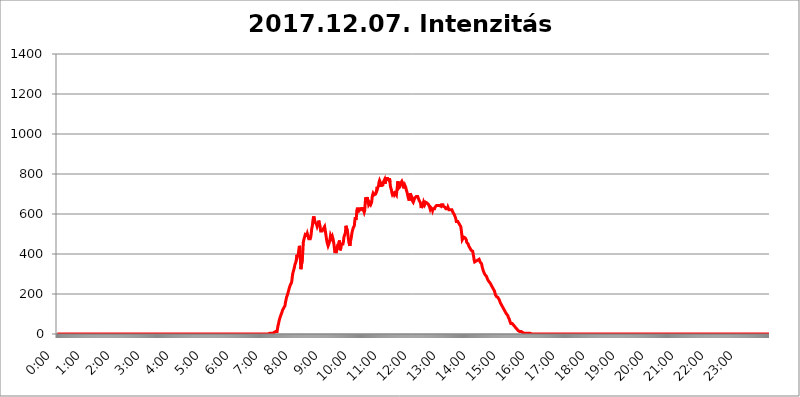
| Category | 2017.12.07. Intenzitás [W/m^2] |
|---|---|
| 0.0 | 0 |
| 0.0006944444444444445 | 0 |
| 0.001388888888888889 | 0 |
| 0.0020833333333333333 | 0 |
| 0.002777777777777778 | 0 |
| 0.003472222222222222 | 0 |
| 0.004166666666666667 | 0 |
| 0.004861111111111111 | 0 |
| 0.005555555555555556 | 0 |
| 0.0062499999999999995 | 0 |
| 0.006944444444444444 | 0 |
| 0.007638888888888889 | 0 |
| 0.008333333333333333 | 0 |
| 0.009027777777777779 | 0 |
| 0.009722222222222222 | 0 |
| 0.010416666666666666 | 0 |
| 0.011111111111111112 | 0 |
| 0.011805555555555555 | 0 |
| 0.012499999999999999 | 0 |
| 0.013194444444444444 | 0 |
| 0.013888888888888888 | 0 |
| 0.014583333333333332 | 0 |
| 0.015277777777777777 | 0 |
| 0.015972222222222224 | 0 |
| 0.016666666666666666 | 0 |
| 0.017361111111111112 | 0 |
| 0.018055555555555557 | 0 |
| 0.01875 | 0 |
| 0.019444444444444445 | 0 |
| 0.02013888888888889 | 0 |
| 0.020833333333333332 | 0 |
| 0.02152777777777778 | 0 |
| 0.022222222222222223 | 0 |
| 0.02291666666666667 | 0 |
| 0.02361111111111111 | 0 |
| 0.024305555555555556 | 0 |
| 0.024999999999999998 | 0 |
| 0.025694444444444447 | 0 |
| 0.02638888888888889 | 0 |
| 0.027083333333333334 | 0 |
| 0.027777777777777776 | 0 |
| 0.02847222222222222 | 0 |
| 0.029166666666666664 | 0 |
| 0.029861111111111113 | 0 |
| 0.030555555555555555 | 0 |
| 0.03125 | 0 |
| 0.03194444444444445 | 0 |
| 0.03263888888888889 | 0 |
| 0.03333333333333333 | 0 |
| 0.034027777777777775 | 0 |
| 0.034722222222222224 | 0 |
| 0.035416666666666666 | 0 |
| 0.036111111111111115 | 0 |
| 0.03680555555555556 | 0 |
| 0.0375 | 0 |
| 0.03819444444444444 | 0 |
| 0.03888888888888889 | 0 |
| 0.03958333333333333 | 0 |
| 0.04027777777777778 | 0 |
| 0.04097222222222222 | 0 |
| 0.041666666666666664 | 0 |
| 0.042361111111111106 | 0 |
| 0.04305555555555556 | 0 |
| 0.043750000000000004 | 0 |
| 0.044444444444444446 | 0 |
| 0.04513888888888889 | 0 |
| 0.04583333333333334 | 0 |
| 0.04652777777777778 | 0 |
| 0.04722222222222222 | 0 |
| 0.04791666666666666 | 0 |
| 0.04861111111111111 | 0 |
| 0.049305555555555554 | 0 |
| 0.049999999999999996 | 0 |
| 0.05069444444444445 | 0 |
| 0.051388888888888894 | 0 |
| 0.052083333333333336 | 0 |
| 0.05277777777777778 | 0 |
| 0.05347222222222222 | 0 |
| 0.05416666666666667 | 0 |
| 0.05486111111111111 | 0 |
| 0.05555555555555555 | 0 |
| 0.05625 | 0 |
| 0.05694444444444444 | 0 |
| 0.057638888888888885 | 0 |
| 0.05833333333333333 | 0 |
| 0.05902777777777778 | 0 |
| 0.059722222222222225 | 0 |
| 0.06041666666666667 | 0 |
| 0.061111111111111116 | 0 |
| 0.06180555555555556 | 0 |
| 0.0625 | 0 |
| 0.06319444444444444 | 0 |
| 0.06388888888888888 | 0 |
| 0.06458333333333334 | 0 |
| 0.06527777777777778 | 0 |
| 0.06597222222222222 | 0 |
| 0.06666666666666667 | 0 |
| 0.06736111111111111 | 0 |
| 0.06805555555555555 | 0 |
| 0.06874999999999999 | 0 |
| 0.06944444444444443 | 0 |
| 0.07013888888888889 | 0 |
| 0.07083333333333333 | 0 |
| 0.07152777777777779 | 0 |
| 0.07222222222222223 | 0 |
| 0.07291666666666667 | 0 |
| 0.07361111111111111 | 0 |
| 0.07430555555555556 | 0 |
| 0.075 | 0 |
| 0.07569444444444444 | 0 |
| 0.0763888888888889 | 0 |
| 0.07708333333333334 | 0 |
| 0.07777777777777778 | 0 |
| 0.07847222222222222 | 0 |
| 0.07916666666666666 | 0 |
| 0.0798611111111111 | 0 |
| 0.08055555555555556 | 0 |
| 0.08125 | 0 |
| 0.08194444444444444 | 0 |
| 0.08263888888888889 | 0 |
| 0.08333333333333333 | 0 |
| 0.08402777777777777 | 0 |
| 0.08472222222222221 | 0 |
| 0.08541666666666665 | 0 |
| 0.08611111111111112 | 0 |
| 0.08680555555555557 | 0 |
| 0.08750000000000001 | 0 |
| 0.08819444444444445 | 0 |
| 0.08888888888888889 | 0 |
| 0.08958333333333333 | 0 |
| 0.09027777777777778 | 0 |
| 0.09097222222222222 | 0 |
| 0.09166666666666667 | 0 |
| 0.09236111111111112 | 0 |
| 0.09305555555555556 | 0 |
| 0.09375 | 0 |
| 0.09444444444444444 | 0 |
| 0.09513888888888888 | 0 |
| 0.09583333333333333 | 0 |
| 0.09652777777777777 | 0 |
| 0.09722222222222222 | 0 |
| 0.09791666666666667 | 0 |
| 0.09861111111111111 | 0 |
| 0.09930555555555555 | 0 |
| 0.09999999999999999 | 0 |
| 0.10069444444444443 | 0 |
| 0.1013888888888889 | 0 |
| 0.10208333333333335 | 0 |
| 0.10277777777777779 | 0 |
| 0.10347222222222223 | 0 |
| 0.10416666666666667 | 0 |
| 0.10486111111111111 | 0 |
| 0.10555555555555556 | 0 |
| 0.10625 | 0 |
| 0.10694444444444444 | 0 |
| 0.1076388888888889 | 0 |
| 0.10833333333333334 | 0 |
| 0.10902777777777778 | 0 |
| 0.10972222222222222 | 0 |
| 0.1111111111111111 | 0 |
| 0.11180555555555556 | 0 |
| 0.11180555555555556 | 0 |
| 0.1125 | 0 |
| 0.11319444444444444 | 0 |
| 0.11388888888888889 | 0 |
| 0.11458333333333333 | 0 |
| 0.11527777777777777 | 0 |
| 0.11597222222222221 | 0 |
| 0.11666666666666665 | 0 |
| 0.1173611111111111 | 0 |
| 0.11805555555555557 | 0 |
| 0.11944444444444445 | 0 |
| 0.12013888888888889 | 0 |
| 0.12083333333333333 | 0 |
| 0.12152777777777778 | 0 |
| 0.12222222222222223 | 0 |
| 0.12291666666666667 | 0 |
| 0.12291666666666667 | 0 |
| 0.12361111111111112 | 0 |
| 0.12430555555555556 | 0 |
| 0.125 | 0 |
| 0.12569444444444444 | 0 |
| 0.12638888888888888 | 0 |
| 0.12708333333333333 | 0 |
| 0.16875 | 0 |
| 0.12847222222222224 | 0 |
| 0.12916666666666668 | 0 |
| 0.12986111111111112 | 0 |
| 0.13055555555555556 | 0 |
| 0.13125 | 0 |
| 0.13194444444444445 | 0 |
| 0.1326388888888889 | 0 |
| 0.13333333333333333 | 0 |
| 0.13402777777777777 | 0 |
| 0.13402777777777777 | 0 |
| 0.13472222222222222 | 0 |
| 0.13541666666666666 | 0 |
| 0.1361111111111111 | 0 |
| 0.13749999999999998 | 0 |
| 0.13819444444444443 | 0 |
| 0.1388888888888889 | 0 |
| 0.13958333333333334 | 0 |
| 0.14027777777777778 | 0 |
| 0.14097222222222222 | 0 |
| 0.14166666666666666 | 0 |
| 0.1423611111111111 | 0 |
| 0.14305555555555557 | 0 |
| 0.14375000000000002 | 0 |
| 0.14444444444444446 | 0 |
| 0.1451388888888889 | 0 |
| 0.1451388888888889 | 0 |
| 0.14652777777777778 | 0 |
| 0.14722222222222223 | 0 |
| 0.14791666666666667 | 0 |
| 0.1486111111111111 | 0 |
| 0.14930555555555555 | 0 |
| 0.15 | 0 |
| 0.15069444444444444 | 0 |
| 0.15138888888888888 | 0 |
| 0.15208333333333332 | 0 |
| 0.15277777777777776 | 0 |
| 0.15347222222222223 | 0 |
| 0.15416666666666667 | 0 |
| 0.15486111111111112 | 0 |
| 0.15555555555555556 | 0 |
| 0.15625 | 0 |
| 0.15694444444444444 | 0 |
| 0.15763888888888888 | 0 |
| 0.15833333333333333 | 0 |
| 0.15902777777777777 | 0 |
| 0.15972222222222224 | 0 |
| 0.16041666666666668 | 0 |
| 0.16111111111111112 | 0 |
| 0.16180555555555556 | 0 |
| 0.1625 | 0 |
| 0.16319444444444445 | 0 |
| 0.1638888888888889 | 0 |
| 0.16458333333333333 | 0 |
| 0.16527777777777777 | 0 |
| 0.16597222222222222 | 0 |
| 0.16666666666666666 | 0 |
| 0.1673611111111111 | 0 |
| 0.16805555555555554 | 0 |
| 0.16874999999999998 | 0 |
| 0.16944444444444443 | 0 |
| 0.17013888888888887 | 0 |
| 0.1708333333333333 | 0 |
| 0.17152777777777775 | 0 |
| 0.17222222222222225 | 0 |
| 0.1729166666666667 | 0 |
| 0.17361111111111113 | 0 |
| 0.17430555555555557 | 0 |
| 0.17500000000000002 | 0 |
| 0.17569444444444446 | 0 |
| 0.1763888888888889 | 0 |
| 0.17708333333333334 | 0 |
| 0.17777777777777778 | 0 |
| 0.17847222222222223 | 0 |
| 0.17916666666666667 | 0 |
| 0.1798611111111111 | 0 |
| 0.18055555555555555 | 0 |
| 0.18125 | 0 |
| 0.18194444444444444 | 0 |
| 0.1826388888888889 | 0 |
| 0.18333333333333335 | 0 |
| 0.1840277777777778 | 0 |
| 0.18472222222222223 | 0 |
| 0.18541666666666667 | 0 |
| 0.18611111111111112 | 0 |
| 0.18680555555555556 | 0 |
| 0.1875 | 0 |
| 0.18819444444444444 | 0 |
| 0.18888888888888888 | 0 |
| 0.18958333333333333 | 0 |
| 0.19027777777777777 | 0 |
| 0.1909722222222222 | 0 |
| 0.19166666666666665 | 0 |
| 0.19236111111111112 | 0 |
| 0.19305555555555554 | 0 |
| 0.19375 | 0 |
| 0.19444444444444445 | 0 |
| 0.1951388888888889 | 0 |
| 0.19583333333333333 | 0 |
| 0.19652777777777777 | 0 |
| 0.19722222222222222 | 0 |
| 0.19791666666666666 | 0 |
| 0.1986111111111111 | 0 |
| 0.19930555555555554 | 0 |
| 0.19999999999999998 | 0 |
| 0.20069444444444443 | 0 |
| 0.20138888888888887 | 0 |
| 0.2020833333333333 | 0 |
| 0.2027777777777778 | 0 |
| 0.2034722222222222 | 0 |
| 0.2041666666666667 | 0 |
| 0.20486111111111113 | 0 |
| 0.20555555555555557 | 0 |
| 0.20625000000000002 | 0 |
| 0.20694444444444446 | 0 |
| 0.2076388888888889 | 0 |
| 0.20833333333333334 | 0 |
| 0.20902777777777778 | 0 |
| 0.20972222222222223 | 0 |
| 0.21041666666666667 | 0 |
| 0.2111111111111111 | 0 |
| 0.21180555555555555 | 0 |
| 0.2125 | 0 |
| 0.21319444444444444 | 0 |
| 0.2138888888888889 | 0 |
| 0.21458333333333335 | 0 |
| 0.2152777777777778 | 0 |
| 0.21597222222222223 | 0 |
| 0.21666666666666667 | 0 |
| 0.21736111111111112 | 0 |
| 0.21805555555555556 | 0 |
| 0.21875 | 0 |
| 0.21944444444444444 | 0 |
| 0.22013888888888888 | 0 |
| 0.22083333333333333 | 0 |
| 0.22152777777777777 | 0 |
| 0.2222222222222222 | 0 |
| 0.22291666666666665 | 0 |
| 0.2236111111111111 | 0 |
| 0.22430555555555556 | 0 |
| 0.225 | 0 |
| 0.22569444444444445 | 0 |
| 0.2263888888888889 | 0 |
| 0.22708333333333333 | 0 |
| 0.22777777777777777 | 0 |
| 0.22847222222222222 | 0 |
| 0.22916666666666666 | 0 |
| 0.2298611111111111 | 0 |
| 0.23055555555555554 | 0 |
| 0.23124999999999998 | 0 |
| 0.23194444444444443 | 0 |
| 0.23263888888888887 | 0 |
| 0.2333333333333333 | 0 |
| 0.2340277777777778 | 0 |
| 0.2347222222222222 | 0 |
| 0.2354166666666667 | 0 |
| 0.23611111111111113 | 0 |
| 0.23680555555555557 | 0 |
| 0.23750000000000002 | 0 |
| 0.23819444444444446 | 0 |
| 0.2388888888888889 | 0 |
| 0.23958333333333334 | 0 |
| 0.24027777777777778 | 0 |
| 0.24097222222222223 | 0 |
| 0.24166666666666667 | 0 |
| 0.2423611111111111 | 0 |
| 0.24305555555555555 | 0 |
| 0.24375 | 0 |
| 0.24444444444444446 | 0 |
| 0.24513888888888888 | 0 |
| 0.24583333333333335 | 0 |
| 0.2465277777777778 | 0 |
| 0.24722222222222223 | 0 |
| 0.24791666666666667 | 0 |
| 0.24861111111111112 | 0 |
| 0.24930555555555556 | 0 |
| 0.25 | 0 |
| 0.25069444444444444 | 0 |
| 0.2513888888888889 | 0 |
| 0.2520833333333333 | 0 |
| 0.25277777777777777 | 0 |
| 0.2534722222222222 | 0 |
| 0.25416666666666665 | 0 |
| 0.2548611111111111 | 0 |
| 0.2555555555555556 | 0 |
| 0.25625000000000003 | 0 |
| 0.2569444444444445 | 0 |
| 0.2576388888888889 | 0 |
| 0.25833333333333336 | 0 |
| 0.2590277777777778 | 0 |
| 0.25972222222222224 | 0 |
| 0.2604166666666667 | 0 |
| 0.2611111111111111 | 0 |
| 0.26180555555555557 | 0 |
| 0.2625 | 0 |
| 0.26319444444444445 | 0 |
| 0.2638888888888889 | 0 |
| 0.26458333333333334 | 0 |
| 0.2652777777777778 | 0 |
| 0.2659722222222222 | 0 |
| 0.26666666666666666 | 0 |
| 0.2673611111111111 | 0 |
| 0.26805555555555555 | 0 |
| 0.26875 | 0 |
| 0.26944444444444443 | 0 |
| 0.2701388888888889 | 0 |
| 0.2708333333333333 | 0 |
| 0.27152777777777776 | 0 |
| 0.2722222222222222 | 0 |
| 0.27291666666666664 | 0 |
| 0.2736111111111111 | 0 |
| 0.2743055555555555 | 0 |
| 0.27499999999999997 | 0 |
| 0.27569444444444446 | 0 |
| 0.27638888888888885 | 0 |
| 0.27708333333333335 | 0 |
| 0.2777777777777778 | 0 |
| 0.27847222222222223 | 0 |
| 0.2791666666666667 | 0 |
| 0.2798611111111111 | 0 |
| 0.28055555555555556 | 0 |
| 0.28125 | 0 |
| 0.28194444444444444 | 0 |
| 0.2826388888888889 | 0 |
| 0.2833333333333333 | 0 |
| 0.28402777777777777 | 0 |
| 0.2847222222222222 | 0 |
| 0.28541666666666665 | 0 |
| 0.28611111111111115 | 0 |
| 0.28680555555555554 | 0 |
| 0.28750000000000003 | 0 |
| 0.2881944444444445 | 0 |
| 0.2888888888888889 | 0 |
| 0.28958333333333336 | 0 |
| 0.2902777777777778 | 0 |
| 0.29097222222222224 | 0 |
| 0.2916666666666667 | 0 |
| 0.2923611111111111 | 0 |
| 0.29305555555555557 | 0 |
| 0.29375 | 0 |
| 0.29444444444444445 | 0 |
| 0.2951388888888889 | 0 |
| 0.29583333333333334 | 0 |
| 0.2965277777777778 | 0 |
| 0.2972222222222222 | 0 |
| 0.29791666666666666 | 3.525 |
| 0.2986111111111111 | 3.525 |
| 0.29930555555555555 | 3.525 |
| 0.3 | 3.525 |
| 0.30069444444444443 | 3.525 |
| 0.3013888888888889 | 3.525 |
| 0.3020833333333333 | 3.525 |
| 0.30277777777777776 | 3.525 |
| 0.3034722222222222 | 7.887 |
| 0.30416666666666664 | 7.887 |
| 0.3048611111111111 | 7.887 |
| 0.3055555555555555 | 7.887 |
| 0.30624999999999997 | 12.257 |
| 0.3069444444444444 | 12.257 |
| 0.3076388888888889 | 12.257 |
| 0.30833333333333335 | 12.257 |
| 0.3090277777777778 | 29.823 |
| 0.30972222222222223 | 43.079 |
| 0.3104166666666667 | 51.951 |
| 0.3111111111111111 | 65.31 |
| 0.31180555555555556 | 74.246 |
| 0.3125 | 83.205 |
| 0.31319444444444444 | 87.692 |
| 0.3138888888888889 | 96.682 |
| 0.3145833333333333 | 101.184 |
| 0.31527777777777777 | 110.201 |
| 0.3159722222222222 | 119.235 |
| 0.31666666666666665 | 123.758 |
| 0.31736111111111115 | 128.284 |
| 0.31805555555555554 | 128.284 |
| 0.31875000000000003 | 128.284 |
| 0.3194444444444445 | 141.884 |
| 0.3201388888888889 | 160.056 |
| 0.32083333333333336 | 169.156 |
| 0.3215277777777778 | 182.82 |
| 0.32222222222222224 | 187.378 |
| 0.3229166666666667 | 196.497 |
| 0.3236111111111111 | 201.058 |
| 0.32430555555555557 | 214.746 |
| 0.325 | 223.873 |
| 0.32569444444444445 | 233 |
| 0.3263888888888889 | 237.564 |
| 0.32708333333333334 | 246.689 |
| 0.3277777777777778 | 251.251 |
| 0.3284722222222222 | 255.813 |
| 0.32916666666666666 | 269.49 |
| 0.3298611111111111 | 292.259 |
| 0.33055555555555555 | 305.898 |
| 0.33125 | 314.98 |
| 0.33194444444444443 | 324.052 |
| 0.3326388888888889 | 333.113 |
| 0.3333333333333333 | 346.682 |
| 0.3340277777777778 | 351.198 |
| 0.3347222222222222 | 360.221 |
| 0.3354166666666667 | 373.729 |
| 0.3361111111111111 | 396.164 |
| 0.3368055555555556 | 387.202 |
| 0.33749999999999997 | 391.685 |
| 0.33819444444444446 | 400.638 |
| 0.33888888888888885 | 422.943 |
| 0.33958333333333335 | 440.702 |
| 0.34027777777777773 | 431.833 |
| 0.34097222222222223 | 373.729 |
| 0.3416666666666666 | 324.052 |
| 0.3423611111111111 | 328.584 |
| 0.3430555555555555 | 328.584 |
| 0.34375 | 373.729 |
| 0.3444444444444445 | 414.035 |
| 0.3451388888888889 | 458.38 |
| 0.3458333333333334 | 471.582 |
| 0.34652777777777777 | 471.582 |
| 0.34722222222222227 | 475.972 |
| 0.34791666666666665 | 497.836 |
| 0.34861111111111115 | 502.192 |
| 0.34930555555555554 | 497.836 |
| 0.35000000000000003 | 493.475 |
| 0.3506944444444444 | 502.192 |
| 0.3513888888888889 | 502.192 |
| 0.3520833333333333 | 502.192 |
| 0.3527777777777778 | 475.972 |
| 0.3534722222222222 | 475.972 |
| 0.3541666666666667 | 475.972 |
| 0.3548611111111111 | 475.972 |
| 0.35555555555555557 | 484.735 |
| 0.35625 | 502.192 |
| 0.35694444444444445 | 528.2 |
| 0.3576388888888889 | 536.82 |
| 0.35833333333333334 | 558.261 |
| 0.3590277777777778 | 579.542 |
| 0.3597222222222222 | 588.009 |
| 0.36041666666666666 | 588.009 |
| 0.3611111111111111 | 566.793 |
| 0.36180555555555555 | 558.261 |
| 0.3625 | 562.53 |
| 0.36319444444444443 | 558.261 |
| 0.3638888888888889 | 545.416 |
| 0.3645833333333333 | 536.82 |
| 0.3652777777777778 | 541.121 |
| 0.3659722222222222 | 549.704 |
| 0.3666666666666667 | 566.793 |
| 0.3673611111111111 | 558.261 |
| 0.3680555555555556 | 558.261 |
| 0.36874999999999997 | 536.82 |
| 0.36944444444444446 | 515.223 |
| 0.37013888888888885 | 515.223 |
| 0.37083333333333335 | 515.223 |
| 0.37152777777777773 | 515.223 |
| 0.37222222222222223 | 510.885 |
| 0.3729166666666666 | 510.885 |
| 0.3736111111111111 | 528.2 |
| 0.3743055555555555 | 523.88 |
| 0.375 | 536.82 |
| 0.3756944444444445 | 536.82 |
| 0.3763888888888889 | 506.542 |
| 0.3770833333333334 | 489.108 |
| 0.37777777777777777 | 471.582 |
| 0.37847222222222227 | 458.38 |
| 0.37916666666666665 | 458.38 |
| 0.37986111111111115 | 440.702 |
| 0.38055555555555554 | 445.129 |
| 0.38125000000000003 | 453.968 |
| 0.3819444444444444 | 462.786 |
| 0.3826388888888889 | 475.972 |
| 0.3833333333333333 | 493.475 |
| 0.3840277777777778 | 497.836 |
| 0.3847222222222222 | 497.836 |
| 0.3854166666666667 | 475.972 |
| 0.3861111111111111 | 484.735 |
| 0.38680555555555557 | 475.972 |
| 0.3875 | 462.786 |
| 0.38819444444444445 | 445.129 |
| 0.3888888888888889 | 422.943 |
| 0.38958333333333334 | 405.108 |
| 0.3902777777777778 | 414.035 |
| 0.3909722222222222 | 405.108 |
| 0.39166666666666666 | 418.492 |
| 0.3923611111111111 | 427.39 |
| 0.39305555555555555 | 431.833 |
| 0.39375 | 449.551 |
| 0.39444444444444443 | 440.702 |
| 0.3951388888888889 | 445.129 |
| 0.3958333333333333 | 467.187 |
| 0.3965277777777778 | 418.492 |
| 0.3972222222222222 | 414.035 |
| 0.3979166666666667 | 431.833 |
| 0.3986111111111111 | 449.551 |
| 0.3993055555555556 | 453.968 |
| 0.39999999999999997 | 453.968 |
| 0.40069444444444446 | 449.551 |
| 0.40138888888888885 | 462.786 |
| 0.40208333333333335 | 484.735 |
| 0.40277777777777773 | 484.735 |
| 0.40347222222222223 | 489.108 |
| 0.4041666666666666 | 506.542 |
| 0.4048611111111111 | 541.121 |
| 0.4055555555555555 | 545.416 |
| 0.40625 | 541.121 |
| 0.4069444444444445 | 515.223 |
| 0.4076388888888889 | 497.836 |
| 0.4083333333333334 | 475.972 |
| 0.40902777777777777 | 458.38 |
| 0.40972222222222227 | 449.551 |
| 0.41041666666666665 | 440.702 |
| 0.41111111111111115 | 462.786 |
| 0.41180555555555554 | 471.582 |
| 0.41250000000000003 | 484.735 |
| 0.4131944444444444 | 502.192 |
| 0.4138888888888889 | 515.223 |
| 0.4145833333333333 | 523.88 |
| 0.4152777777777778 | 532.513 |
| 0.4159722222222222 | 532.513 |
| 0.4166666666666667 | 541.121 |
| 0.4173611111111111 | 566.793 |
| 0.41805555555555557 | 583.779 |
| 0.41875 | 571.049 |
| 0.41944444444444445 | 579.542 |
| 0.4201388888888889 | 617.436 |
| 0.42083333333333334 | 625.784 |
| 0.4215277777777778 | 625.784 |
| 0.4222222222222222 | 629.948 |
| 0.42291666666666666 | 625.784 |
| 0.4236111111111111 | 617.436 |
| 0.42430555555555555 | 621.613 |
| 0.425 | 621.613 |
| 0.42569444444444443 | 625.784 |
| 0.4263888888888889 | 625.784 |
| 0.4270833333333333 | 621.613 |
| 0.4277777777777778 | 621.613 |
| 0.4284722222222222 | 634.105 |
| 0.4291666666666667 | 629.948 |
| 0.4298611111111111 | 617.436 |
| 0.4305555555555556 | 609.062 |
| 0.43124999999999997 | 617.436 |
| 0.43194444444444446 | 654.791 |
| 0.43263888888888885 | 683.473 |
| 0.43333333333333335 | 683.473 |
| 0.43402777777777773 | 671.22 |
| 0.43472222222222223 | 683.473 |
| 0.4354166666666666 | 687.544 |
| 0.4361111111111111 | 663.019 |
| 0.4368055555555555 | 646.537 |
| 0.4375 | 650.667 |
| 0.4381944444444445 | 654.791 |
| 0.4388888888888889 | 650.667 |
| 0.4395833333333334 | 646.537 |
| 0.44027777777777777 | 650.667 |
| 0.44097222222222227 | 658.909 |
| 0.44166666666666665 | 683.473 |
| 0.44236111111111115 | 695.666 |
| 0.44305555555555554 | 703.762 |
| 0.44375000000000003 | 699.717 |
| 0.4444444444444444 | 695.666 |
| 0.4451388888888889 | 695.666 |
| 0.4458333333333333 | 695.666 |
| 0.4465277777777778 | 699.717 |
| 0.4472222222222222 | 707.8 |
| 0.4479166666666667 | 719.877 |
| 0.4486111111111111 | 735.89 |
| 0.44930555555555557 | 727.896 |
| 0.45 | 727.896 |
| 0.45069444444444445 | 743.859 |
| 0.4513888888888889 | 759.723 |
| 0.45208333333333334 | 767.62 |
| 0.4527777777777778 | 771.559 |
| 0.4534722222222222 | 755.766 |
| 0.45416666666666666 | 735.89 |
| 0.4548611111111111 | 755.766 |
| 0.45555555555555555 | 751.803 |
| 0.45625 | 739.877 |
| 0.45694444444444443 | 755.766 |
| 0.4576388888888889 | 759.723 |
| 0.4583333333333333 | 759.723 |
| 0.4590277777777778 | 771.559 |
| 0.4597222222222222 | 751.803 |
| 0.4604166666666667 | 759.723 |
| 0.4611111111111111 | 783.342 |
| 0.4618055555555556 | 771.559 |
| 0.46249999999999997 | 783.342 |
| 0.46319444444444446 | 775.492 |
| 0.46388888888888885 | 775.492 |
| 0.46458333333333335 | 775.492 |
| 0.46527777777777773 | 767.62 |
| 0.46597222222222223 | 779.42 |
| 0.4666666666666666 | 759.723 |
| 0.4673611111111111 | 735.89 |
| 0.4680555555555555 | 731.896 |
| 0.46875 | 719.877 |
| 0.4694444444444445 | 703.762 |
| 0.4701388888888889 | 695.666 |
| 0.4708333333333334 | 695.666 |
| 0.47152777777777777 | 691.608 |
| 0.47222222222222227 | 703.762 |
| 0.47291666666666665 | 695.666 |
| 0.47361111111111115 | 699.717 |
| 0.47430555555555554 | 703.762 |
| 0.47500000000000003 | 699.717 |
| 0.4756944444444444 | 695.666 |
| 0.4763888888888889 | 719.877 |
| 0.4770833333333333 | 739.877 |
| 0.4777777777777778 | 763.674 |
| 0.4784722222222222 | 727.896 |
| 0.4791666666666667 | 727.896 |
| 0.4798611111111111 | 727.896 |
| 0.48055555555555557 | 735.89 |
| 0.48125 | 735.89 |
| 0.48194444444444445 | 755.766 |
| 0.4826388888888889 | 759.723 |
| 0.48333333333333334 | 763.674 |
| 0.4840277777777778 | 763.674 |
| 0.4847222222222222 | 751.803 |
| 0.48541666666666666 | 739.877 |
| 0.4861111111111111 | 727.896 |
| 0.48680555555555555 | 731.896 |
| 0.4875 | 743.859 |
| 0.48819444444444443 | 739.877 |
| 0.4888888888888889 | 731.896 |
| 0.4895833333333333 | 719.877 |
| 0.4902777777777778 | 711.832 |
| 0.4909722222222222 | 703.762 |
| 0.4916666666666667 | 691.608 |
| 0.4923611111111111 | 679.395 |
| 0.4930555555555556 | 679.395 |
| 0.49374999999999997 | 667.123 |
| 0.49444444444444446 | 687.544 |
| 0.49513888888888885 | 703.762 |
| 0.49583333333333335 | 695.666 |
| 0.49652777777777773 | 695.666 |
| 0.49722222222222223 | 687.544 |
| 0.4979166666666666 | 667.123 |
| 0.4986111111111111 | 667.123 |
| 0.4993055555555555 | 658.909 |
| 0.5 | 663.019 |
| 0.5006944444444444 | 658.909 |
| 0.5013888888888889 | 679.395 |
| 0.5020833333333333 | 679.395 |
| 0.5027777777777778 | 683.473 |
| 0.5034722222222222 | 687.544 |
| 0.5041666666666667 | 683.473 |
| 0.5048611111111111 | 683.473 |
| 0.5055555555555555 | 687.544 |
| 0.50625 | 687.544 |
| 0.5069444444444444 | 687.544 |
| 0.5076388888888889 | 667.123 |
| 0.5083333333333333 | 663.019 |
| 0.5090277777777777 | 658.909 |
| 0.5097222222222222 | 650.667 |
| 0.5104166666666666 | 629.948 |
| 0.5111111111111112 | 629.948 |
| 0.5118055555555555 | 642.4 |
| 0.5125000000000001 | 634.105 |
| 0.5131944444444444 | 646.537 |
| 0.513888888888889 | 658.909 |
| 0.5145833333333333 | 658.909 |
| 0.5152777777777778 | 646.537 |
| 0.5159722222222222 | 650.667 |
| 0.5166666666666667 | 658.909 |
| 0.517361111111111 | 658.909 |
| 0.5180555555555556 | 658.909 |
| 0.5187499999999999 | 654.791 |
| 0.5194444444444445 | 654.791 |
| 0.5201388888888888 | 650.667 |
| 0.5208333333333334 | 646.537 |
| 0.5215277777777778 | 642.4 |
| 0.5222222222222223 | 634.105 |
| 0.5229166666666667 | 625.784 |
| 0.5236111111111111 | 634.105 |
| 0.5243055555555556 | 634.105 |
| 0.525 | 634.105 |
| 0.5256944444444445 | 625.784 |
| 0.5263888888888889 | 617.436 |
| 0.5270833333333333 | 625.784 |
| 0.5277777777777778 | 629.948 |
| 0.5284722222222222 | 629.948 |
| 0.5291666666666667 | 625.784 |
| 0.5298611111111111 | 634.105 |
| 0.5305555555555556 | 638.256 |
| 0.53125 | 638.256 |
| 0.5319444444444444 | 642.4 |
| 0.5326388888888889 | 638.256 |
| 0.5333333333333333 | 642.4 |
| 0.5340277777777778 | 642.4 |
| 0.5347222222222222 | 642.4 |
| 0.5354166666666667 | 642.4 |
| 0.5361111111111111 | 642.4 |
| 0.5368055555555555 | 642.4 |
| 0.5375 | 646.537 |
| 0.5381944444444444 | 638.256 |
| 0.5388888888888889 | 646.537 |
| 0.5395833333333333 | 646.537 |
| 0.5402777777777777 | 650.667 |
| 0.5409722222222222 | 646.537 |
| 0.5416666666666666 | 638.256 |
| 0.5423611111111112 | 634.105 |
| 0.5430555555555555 | 634.105 |
| 0.5437500000000001 | 634.105 |
| 0.5444444444444444 | 629.948 |
| 0.545138888888889 | 625.784 |
| 0.5458333333333333 | 625.784 |
| 0.5465277777777778 | 629.948 |
| 0.5472222222222222 | 625.784 |
| 0.5479166666666667 | 634.105 |
| 0.548611111111111 | 629.948 |
| 0.5493055555555556 | 621.613 |
| 0.5499999999999999 | 625.784 |
| 0.5506944444444445 | 621.613 |
| 0.5513888888888888 | 621.613 |
| 0.5520833333333334 | 625.784 |
| 0.5527777777777778 | 621.613 |
| 0.5534722222222223 | 621.613 |
| 0.5541666666666667 | 617.436 |
| 0.5548611111111111 | 609.062 |
| 0.5555555555555556 | 609.062 |
| 0.55625 | 604.864 |
| 0.5569444444444445 | 596.45 |
| 0.5576388888888889 | 592.233 |
| 0.5583333333333333 | 583.779 |
| 0.5590277777777778 | 575.299 |
| 0.5597222222222222 | 562.53 |
| 0.5604166666666667 | 562.53 |
| 0.5611111111111111 | 562.53 |
| 0.5618055555555556 | 562.53 |
| 0.5625 | 558.261 |
| 0.5631944444444444 | 553.986 |
| 0.5638888888888889 | 549.704 |
| 0.5645833333333333 | 545.416 |
| 0.5652777777777778 | 541.121 |
| 0.5659722222222222 | 536.82 |
| 0.5666666666666667 | 519.555 |
| 0.5673611111111111 | 497.836 |
| 0.5680555555555555 | 471.582 |
| 0.56875 | 471.582 |
| 0.5694444444444444 | 471.582 |
| 0.5701388888888889 | 484.735 |
| 0.5708333333333333 | 489.108 |
| 0.5715277777777777 | 489.108 |
| 0.5722222222222222 | 480.356 |
| 0.5729166666666666 | 475.972 |
| 0.5736111111111112 | 471.582 |
| 0.5743055555555555 | 458.38 |
| 0.5750000000000001 | 458.38 |
| 0.5756944444444444 | 462.786 |
| 0.576388888888889 | 449.551 |
| 0.5770833333333333 | 440.702 |
| 0.5777777777777778 | 436.27 |
| 0.5784722222222222 | 431.833 |
| 0.5791666666666667 | 431.833 |
| 0.579861111111111 | 431.833 |
| 0.5805555555555556 | 418.492 |
| 0.5812499999999999 | 414.035 |
| 0.5819444444444445 | 414.035 |
| 0.5826388888888888 | 414.035 |
| 0.5833333333333334 | 400.638 |
| 0.5840277777777778 | 387.202 |
| 0.5847222222222223 | 369.23 |
| 0.5854166666666667 | 360.221 |
| 0.5861111111111111 | 360.221 |
| 0.5868055555555556 | 360.221 |
| 0.5875 | 364.728 |
| 0.5881944444444445 | 360.221 |
| 0.5888888888888889 | 364.728 |
| 0.5895833333333333 | 369.23 |
| 0.5902777777777778 | 364.728 |
| 0.5909722222222222 | 369.23 |
| 0.5916666666666667 | 373.729 |
| 0.5923611111111111 | 369.23 |
| 0.5930555555555556 | 360.221 |
| 0.59375 | 360.221 |
| 0.5944444444444444 | 355.712 |
| 0.5951388888888889 | 351.198 |
| 0.5958333333333333 | 337.639 |
| 0.5965277777777778 | 328.584 |
| 0.5972222222222222 | 319.517 |
| 0.5979166666666667 | 314.98 |
| 0.5986111111111111 | 305.898 |
| 0.5993055555555555 | 305.898 |
| 0.6 | 296.808 |
| 0.6006944444444444 | 296.808 |
| 0.6013888888888889 | 296.808 |
| 0.6020833333333333 | 287.709 |
| 0.6027777777777777 | 283.156 |
| 0.6034722222222222 | 274.047 |
| 0.6041666666666666 | 269.49 |
| 0.6048611111111112 | 264.932 |
| 0.6055555555555555 | 264.932 |
| 0.6062500000000001 | 260.373 |
| 0.6069444444444444 | 255.813 |
| 0.607638888888889 | 251.251 |
| 0.6083333333333333 | 246.689 |
| 0.6090277777777778 | 242.127 |
| 0.6097222222222222 | 237.564 |
| 0.6104166666666667 | 233 |
| 0.611111111111111 | 233 |
| 0.6118055555555556 | 223.873 |
| 0.6124999999999999 | 219.309 |
| 0.6131944444444445 | 214.746 |
| 0.6138888888888888 | 205.62 |
| 0.6145833333333334 | 196.497 |
| 0.6152777777777778 | 191.937 |
| 0.6159722222222223 | 187.378 |
| 0.6166666666666667 | 182.82 |
| 0.6173611111111111 | 182.82 |
| 0.6180555555555556 | 182.82 |
| 0.61875 | 182.82 |
| 0.6194444444444445 | 178.264 |
| 0.6201388888888889 | 169.156 |
| 0.6208333333333333 | 164.605 |
| 0.6215277777777778 | 155.509 |
| 0.6222222222222222 | 150.964 |
| 0.6229166666666667 | 146.423 |
| 0.6236111111111111 | 141.884 |
| 0.6243055555555556 | 137.347 |
| 0.625 | 132.814 |
| 0.6256944444444444 | 128.284 |
| 0.6263888888888889 | 123.758 |
| 0.6270833333333333 | 119.235 |
| 0.6277777777777778 | 114.716 |
| 0.6284722222222222 | 110.201 |
| 0.6291666666666667 | 110.201 |
| 0.6298611111111111 | 101.184 |
| 0.6305555555555555 | 101.184 |
| 0.63125 | 96.682 |
| 0.6319444444444444 | 92.184 |
| 0.6326388888888889 | 83.205 |
| 0.6333333333333333 | 78.722 |
| 0.6340277777777777 | 74.246 |
| 0.6347222222222222 | 65.31 |
| 0.6354166666666666 | 60.85 |
| 0.6361111111111112 | 51.951 |
| 0.6368055555555555 | 51.951 |
| 0.6375000000000001 | 51.951 |
| 0.6381944444444444 | 51.951 |
| 0.638888888888889 | 51.951 |
| 0.6395833333333333 | 47.511 |
| 0.6402777777777778 | 43.079 |
| 0.6409722222222222 | 38.653 |
| 0.6416666666666667 | 38.653 |
| 0.642361111111111 | 34.234 |
| 0.6430555555555556 | 34.234 |
| 0.6437499999999999 | 29.823 |
| 0.6444444444444445 | 25.419 |
| 0.6451388888888888 | 21.024 |
| 0.6458333333333334 | 21.024 |
| 0.6465277777777778 | 16.636 |
| 0.6472222222222223 | 16.636 |
| 0.6479166666666667 | 16.636 |
| 0.6486111111111111 | 12.257 |
| 0.6493055555555556 | 12.257 |
| 0.65 | 12.257 |
| 0.6506944444444445 | 12.257 |
| 0.6513888888888889 | 12.257 |
| 0.6520833333333333 | 7.887 |
| 0.6527777777777778 | 7.887 |
| 0.6534722222222222 | 7.887 |
| 0.6541666666666667 | 3.525 |
| 0.6548611111111111 | 3.525 |
| 0.6555555555555556 | 3.525 |
| 0.65625 | 3.525 |
| 0.6569444444444444 | 3.525 |
| 0.6576388888888889 | 3.525 |
| 0.6583333333333333 | 3.525 |
| 0.6590277777777778 | 3.525 |
| 0.6597222222222222 | 3.525 |
| 0.6604166666666667 | 3.525 |
| 0.6611111111111111 | 3.525 |
| 0.6618055555555555 | 3.525 |
| 0.6625 | 0 |
| 0.6631944444444444 | 3.525 |
| 0.6638888888888889 | 0 |
| 0.6645833333333333 | 0 |
| 0.6652777777777777 | 0 |
| 0.6659722222222222 | 0 |
| 0.6666666666666666 | 0 |
| 0.6673611111111111 | 0 |
| 0.6680555555555556 | 0 |
| 0.6687500000000001 | 0 |
| 0.6694444444444444 | 0 |
| 0.6701388888888888 | 0 |
| 0.6708333333333334 | 0 |
| 0.6715277777777778 | 0 |
| 0.6722222222222222 | 0 |
| 0.6729166666666666 | 0 |
| 0.6736111111111112 | 0 |
| 0.6743055555555556 | 0 |
| 0.6749999999999999 | 0 |
| 0.6756944444444444 | 0 |
| 0.6763888888888889 | 0 |
| 0.6770833333333334 | 0 |
| 0.6777777777777777 | 0 |
| 0.6784722222222223 | 0 |
| 0.6791666666666667 | 0 |
| 0.6798611111111111 | 0 |
| 0.6805555555555555 | 0 |
| 0.68125 | 0 |
| 0.6819444444444445 | 0 |
| 0.6826388888888889 | 0 |
| 0.6833333333333332 | 0 |
| 0.6840277777777778 | 0 |
| 0.6847222222222222 | 0 |
| 0.6854166666666667 | 0 |
| 0.686111111111111 | 0 |
| 0.6868055555555556 | 0 |
| 0.6875 | 0 |
| 0.6881944444444444 | 0 |
| 0.688888888888889 | 0 |
| 0.6895833333333333 | 0 |
| 0.6902777777777778 | 0 |
| 0.6909722222222222 | 0 |
| 0.6916666666666668 | 0 |
| 0.6923611111111111 | 0 |
| 0.6930555555555555 | 0 |
| 0.69375 | 0 |
| 0.6944444444444445 | 0 |
| 0.6951388888888889 | 0 |
| 0.6958333333333333 | 0 |
| 0.6965277777777777 | 0 |
| 0.6972222222222223 | 0 |
| 0.6979166666666666 | 0 |
| 0.6986111111111111 | 0 |
| 0.6993055555555556 | 0 |
| 0.7000000000000001 | 0 |
| 0.7006944444444444 | 0 |
| 0.7013888888888888 | 0 |
| 0.7020833333333334 | 0 |
| 0.7027777777777778 | 0 |
| 0.7034722222222222 | 0 |
| 0.7041666666666666 | 0 |
| 0.7048611111111112 | 0 |
| 0.7055555555555556 | 0 |
| 0.7062499999999999 | 0 |
| 0.7069444444444444 | 0 |
| 0.7076388888888889 | 0 |
| 0.7083333333333334 | 0 |
| 0.7090277777777777 | 0 |
| 0.7097222222222223 | 0 |
| 0.7104166666666667 | 0 |
| 0.7111111111111111 | 0 |
| 0.7118055555555555 | 0 |
| 0.7125 | 0 |
| 0.7131944444444445 | 0 |
| 0.7138888888888889 | 0 |
| 0.7145833333333332 | 0 |
| 0.7152777777777778 | 0 |
| 0.7159722222222222 | 0 |
| 0.7166666666666667 | 0 |
| 0.717361111111111 | 0 |
| 0.7180555555555556 | 0 |
| 0.71875 | 0 |
| 0.7194444444444444 | 0 |
| 0.720138888888889 | 0 |
| 0.7208333333333333 | 0 |
| 0.7215277777777778 | 0 |
| 0.7222222222222222 | 0 |
| 0.7229166666666668 | 0 |
| 0.7236111111111111 | 0 |
| 0.7243055555555555 | 0 |
| 0.725 | 0 |
| 0.7256944444444445 | 0 |
| 0.7263888888888889 | 0 |
| 0.7270833333333333 | 0 |
| 0.7277777777777777 | 0 |
| 0.7284722222222223 | 0 |
| 0.7291666666666666 | 0 |
| 0.7298611111111111 | 0 |
| 0.7305555555555556 | 0 |
| 0.7312500000000001 | 0 |
| 0.7319444444444444 | 0 |
| 0.7326388888888888 | 0 |
| 0.7333333333333334 | 0 |
| 0.7340277777777778 | 0 |
| 0.7347222222222222 | 0 |
| 0.7354166666666666 | 0 |
| 0.7361111111111112 | 0 |
| 0.7368055555555556 | 0 |
| 0.7374999999999999 | 0 |
| 0.7381944444444444 | 0 |
| 0.7388888888888889 | 0 |
| 0.7395833333333334 | 0 |
| 0.7402777777777777 | 0 |
| 0.7409722222222223 | 0 |
| 0.7416666666666667 | 0 |
| 0.7423611111111111 | 0 |
| 0.7430555555555555 | 0 |
| 0.74375 | 0 |
| 0.7444444444444445 | 0 |
| 0.7451388888888889 | 0 |
| 0.7458333333333332 | 0 |
| 0.7465277777777778 | 0 |
| 0.7472222222222222 | 0 |
| 0.7479166666666667 | 0 |
| 0.748611111111111 | 0 |
| 0.7493055555555556 | 0 |
| 0.75 | 0 |
| 0.7506944444444444 | 0 |
| 0.751388888888889 | 0 |
| 0.7520833333333333 | 0 |
| 0.7527777777777778 | 0 |
| 0.7534722222222222 | 0 |
| 0.7541666666666668 | 0 |
| 0.7548611111111111 | 0 |
| 0.7555555555555555 | 0 |
| 0.75625 | 0 |
| 0.7569444444444445 | 0 |
| 0.7576388888888889 | 0 |
| 0.7583333333333333 | 0 |
| 0.7590277777777777 | 0 |
| 0.7597222222222223 | 0 |
| 0.7604166666666666 | 0 |
| 0.7611111111111111 | 0 |
| 0.7618055555555556 | 0 |
| 0.7625000000000001 | 0 |
| 0.7631944444444444 | 0 |
| 0.7638888888888888 | 0 |
| 0.7645833333333334 | 0 |
| 0.7652777777777778 | 0 |
| 0.7659722222222222 | 0 |
| 0.7666666666666666 | 0 |
| 0.7673611111111112 | 0 |
| 0.7680555555555556 | 0 |
| 0.7687499999999999 | 0 |
| 0.7694444444444444 | 0 |
| 0.7701388888888889 | 0 |
| 0.7708333333333334 | 0 |
| 0.7715277777777777 | 0 |
| 0.7722222222222223 | 0 |
| 0.7729166666666667 | 0 |
| 0.7736111111111111 | 0 |
| 0.7743055555555555 | 0 |
| 0.775 | 0 |
| 0.7756944444444445 | 0 |
| 0.7763888888888889 | 0 |
| 0.7770833333333332 | 0 |
| 0.7777777777777778 | 0 |
| 0.7784722222222222 | 0 |
| 0.7791666666666667 | 0 |
| 0.779861111111111 | 0 |
| 0.7805555555555556 | 0 |
| 0.78125 | 0 |
| 0.7819444444444444 | 0 |
| 0.782638888888889 | 0 |
| 0.7833333333333333 | 0 |
| 0.7840277777777778 | 0 |
| 0.7847222222222222 | 0 |
| 0.7854166666666668 | 0 |
| 0.7861111111111111 | 0 |
| 0.7868055555555555 | 0 |
| 0.7875 | 0 |
| 0.7881944444444445 | 0 |
| 0.7888888888888889 | 0 |
| 0.7895833333333333 | 0 |
| 0.7902777777777777 | 0 |
| 0.7909722222222223 | 0 |
| 0.7916666666666666 | 0 |
| 0.7923611111111111 | 0 |
| 0.7930555555555556 | 0 |
| 0.7937500000000001 | 0 |
| 0.7944444444444444 | 0 |
| 0.7951388888888888 | 0 |
| 0.7958333333333334 | 0 |
| 0.7965277777777778 | 0 |
| 0.7972222222222222 | 0 |
| 0.7979166666666666 | 0 |
| 0.7986111111111112 | 0 |
| 0.7993055555555556 | 0 |
| 0.7999999999999999 | 0 |
| 0.8006944444444444 | 0 |
| 0.8013888888888889 | 0 |
| 0.8020833333333334 | 0 |
| 0.8027777777777777 | 0 |
| 0.8034722222222223 | 0 |
| 0.8041666666666667 | 0 |
| 0.8048611111111111 | 0 |
| 0.8055555555555555 | 0 |
| 0.80625 | 0 |
| 0.8069444444444445 | 0 |
| 0.8076388888888889 | 0 |
| 0.8083333333333332 | 0 |
| 0.8090277777777778 | 0 |
| 0.8097222222222222 | 0 |
| 0.8104166666666667 | 0 |
| 0.811111111111111 | 0 |
| 0.8118055555555556 | 0 |
| 0.8125 | 0 |
| 0.8131944444444444 | 0 |
| 0.813888888888889 | 0 |
| 0.8145833333333333 | 0 |
| 0.8152777777777778 | 0 |
| 0.8159722222222222 | 0 |
| 0.8166666666666668 | 0 |
| 0.8173611111111111 | 0 |
| 0.8180555555555555 | 0 |
| 0.81875 | 0 |
| 0.8194444444444445 | 0 |
| 0.8201388888888889 | 0 |
| 0.8208333333333333 | 0 |
| 0.8215277777777777 | 0 |
| 0.8222222222222223 | 0 |
| 0.8229166666666666 | 0 |
| 0.8236111111111111 | 0 |
| 0.8243055555555556 | 0 |
| 0.8250000000000001 | 0 |
| 0.8256944444444444 | 0 |
| 0.8263888888888888 | 0 |
| 0.8270833333333334 | 0 |
| 0.8277777777777778 | 0 |
| 0.8284722222222222 | 0 |
| 0.8291666666666666 | 0 |
| 0.8298611111111112 | 0 |
| 0.8305555555555556 | 0 |
| 0.8312499999999999 | 0 |
| 0.8319444444444444 | 0 |
| 0.8326388888888889 | 0 |
| 0.8333333333333334 | 0 |
| 0.8340277777777777 | 0 |
| 0.8347222222222223 | 0 |
| 0.8354166666666667 | 0 |
| 0.8361111111111111 | 0 |
| 0.8368055555555555 | 0 |
| 0.8375 | 0 |
| 0.8381944444444445 | 0 |
| 0.8388888888888889 | 0 |
| 0.8395833333333332 | 0 |
| 0.8402777777777778 | 0 |
| 0.8409722222222222 | 0 |
| 0.8416666666666667 | 0 |
| 0.842361111111111 | 0 |
| 0.8430555555555556 | 0 |
| 0.84375 | 0 |
| 0.8444444444444444 | 0 |
| 0.845138888888889 | 0 |
| 0.8458333333333333 | 0 |
| 0.8465277777777778 | 0 |
| 0.8472222222222222 | 0 |
| 0.8479166666666668 | 0 |
| 0.8486111111111111 | 0 |
| 0.8493055555555555 | 0 |
| 0.85 | 0 |
| 0.8506944444444445 | 0 |
| 0.8513888888888889 | 0 |
| 0.8520833333333333 | 0 |
| 0.8527777777777777 | 0 |
| 0.8534722222222223 | 0 |
| 0.8541666666666666 | 0 |
| 0.8548611111111111 | 0 |
| 0.8555555555555556 | 0 |
| 0.8562500000000001 | 0 |
| 0.8569444444444444 | 0 |
| 0.8576388888888888 | 0 |
| 0.8583333333333334 | 0 |
| 0.8590277777777778 | 0 |
| 0.8597222222222222 | 0 |
| 0.8604166666666666 | 0 |
| 0.8611111111111112 | 0 |
| 0.8618055555555556 | 0 |
| 0.8624999999999999 | 0 |
| 0.8631944444444444 | 0 |
| 0.8638888888888889 | 0 |
| 0.8645833333333334 | 0 |
| 0.8652777777777777 | 0 |
| 0.8659722222222223 | 0 |
| 0.8666666666666667 | 0 |
| 0.8673611111111111 | 0 |
| 0.8680555555555555 | 0 |
| 0.86875 | 0 |
| 0.8694444444444445 | 0 |
| 0.8701388888888889 | 0 |
| 0.8708333333333332 | 0 |
| 0.8715277777777778 | 0 |
| 0.8722222222222222 | 0 |
| 0.8729166666666667 | 0 |
| 0.873611111111111 | 0 |
| 0.8743055555555556 | 0 |
| 0.875 | 0 |
| 0.8756944444444444 | 0 |
| 0.876388888888889 | 0 |
| 0.8770833333333333 | 0 |
| 0.8777777777777778 | 0 |
| 0.8784722222222222 | 0 |
| 0.8791666666666668 | 0 |
| 0.8798611111111111 | 0 |
| 0.8805555555555555 | 0 |
| 0.88125 | 0 |
| 0.8819444444444445 | 0 |
| 0.8826388888888889 | 0 |
| 0.8833333333333333 | 0 |
| 0.8840277777777777 | 0 |
| 0.8847222222222223 | 0 |
| 0.8854166666666666 | 0 |
| 0.8861111111111111 | 0 |
| 0.8868055555555556 | 0 |
| 0.8875000000000001 | 0 |
| 0.8881944444444444 | 0 |
| 0.8888888888888888 | 0 |
| 0.8895833333333334 | 0 |
| 0.8902777777777778 | 0 |
| 0.8909722222222222 | 0 |
| 0.8916666666666666 | 0 |
| 0.8923611111111112 | 0 |
| 0.8930555555555556 | 0 |
| 0.8937499999999999 | 0 |
| 0.8944444444444444 | 0 |
| 0.8951388888888889 | 0 |
| 0.8958333333333334 | 0 |
| 0.8965277777777777 | 0 |
| 0.8972222222222223 | 0 |
| 0.8979166666666667 | 0 |
| 0.8986111111111111 | 0 |
| 0.8993055555555555 | 0 |
| 0.9 | 0 |
| 0.9006944444444445 | 0 |
| 0.9013888888888889 | 0 |
| 0.9020833333333332 | 0 |
| 0.9027777777777778 | 0 |
| 0.9034722222222222 | 0 |
| 0.9041666666666667 | 0 |
| 0.904861111111111 | 0 |
| 0.9055555555555556 | 0 |
| 0.90625 | 0 |
| 0.9069444444444444 | 0 |
| 0.907638888888889 | 0 |
| 0.9083333333333333 | 0 |
| 0.9090277777777778 | 0 |
| 0.9097222222222222 | 0 |
| 0.9104166666666668 | 0 |
| 0.9111111111111111 | 0 |
| 0.9118055555555555 | 0 |
| 0.9125 | 0 |
| 0.9131944444444445 | 0 |
| 0.9138888888888889 | 0 |
| 0.9145833333333333 | 0 |
| 0.9152777777777777 | 0 |
| 0.9159722222222223 | 0 |
| 0.9166666666666666 | 0 |
| 0.9173611111111111 | 0 |
| 0.9180555555555556 | 0 |
| 0.9187500000000001 | 0 |
| 0.9194444444444444 | 0 |
| 0.9201388888888888 | 0 |
| 0.9208333333333334 | 0 |
| 0.9215277777777778 | 0 |
| 0.9222222222222222 | 0 |
| 0.9229166666666666 | 0 |
| 0.9236111111111112 | 0 |
| 0.9243055555555556 | 0 |
| 0.9249999999999999 | 0 |
| 0.9256944444444444 | 0 |
| 0.9263888888888889 | 0 |
| 0.9270833333333334 | 0 |
| 0.9277777777777777 | 0 |
| 0.9284722222222223 | 0 |
| 0.9291666666666667 | 0 |
| 0.9298611111111111 | 0 |
| 0.9305555555555555 | 0 |
| 0.93125 | 0 |
| 0.9319444444444445 | 0 |
| 0.9326388888888889 | 0 |
| 0.9333333333333332 | 0 |
| 0.9340277777777778 | 0 |
| 0.9347222222222222 | 0 |
| 0.9354166666666667 | 0 |
| 0.936111111111111 | 0 |
| 0.9368055555555556 | 0 |
| 0.9375 | 0 |
| 0.9381944444444444 | 0 |
| 0.938888888888889 | 0 |
| 0.9395833333333333 | 0 |
| 0.9402777777777778 | 0 |
| 0.9409722222222222 | 0 |
| 0.9416666666666668 | 0 |
| 0.9423611111111111 | 0 |
| 0.9430555555555555 | 0 |
| 0.94375 | 0 |
| 0.9444444444444445 | 0 |
| 0.9451388888888889 | 0 |
| 0.9458333333333333 | 0 |
| 0.9465277777777777 | 0 |
| 0.9472222222222223 | 0 |
| 0.9479166666666666 | 0 |
| 0.9486111111111111 | 0 |
| 0.9493055555555556 | 0 |
| 0.9500000000000001 | 0 |
| 0.9506944444444444 | 0 |
| 0.9513888888888888 | 0 |
| 0.9520833333333334 | 0 |
| 0.9527777777777778 | 0 |
| 0.9534722222222222 | 0 |
| 0.9541666666666666 | 0 |
| 0.9548611111111112 | 0 |
| 0.9555555555555556 | 0 |
| 0.9562499999999999 | 0 |
| 0.9569444444444444 | 0 |
| 0.9576388888888889 | 0 |
| 0.9583333333333334 | 0 |
| 0.9590277777777777 | 0 |
| 0.9597222222222223 | 0 |
| 0.9604166666666667 | 0 |
| 0.9611111111111111 | 0 |
| 0.9618055555555555 | 0 |
| 0.9625 | 0 |
| 0.9631944444444445 | 0 |
| 0.9638888888888889 | 0 |
| 0.9645833333333332 | 0 |
| 0.9652777777777778 | 0 |
| 0.9659722222222222 | 0 |
| 0.9666666666666667 | 0 |
| 0.967361111111111 | 0 |
| 0.9680555555555556 | 0 |
| 0.96875 | 0 |
| 0.9694444444444444 | 0 |
| 0.970138888888889 | 0 |
| 0.9708333333333333 | 0 |
| 0.9715277777777778 | 0 |
| 0.9722222222222222 | 0 |
| 0.9729166666666668 | 0 |
| 0.9736111111111111 | 0 |
| 0.9743055555555555 | 0 |
| 0.975 | 0 |
| 0.9756944444444445 | 0 |
| 0.9763888888888889 | 0 |
| 0.9770833333333333 | 0 |
| 0.9777777777777777 | 0 |
| 0.9784722222222223 | 0 |
| 0.9791666666666666 | 0 |
| 0.9798611111111111 | 0 |
| 0.9805555555555556 | 0 |
| 0.9812500000000001 | 0 |
| 0.9819444444444444 | 0 |
| 0.9826388888888888 | 0 |
| 0.9833333333333334 | 0 |
| 0.9840277777777778 | 0 |
| 0.9847222222222222 | 0 |
| 0.9854166666666666 | 0 |
| 0.9861111111111112 | 0 |
| 0.9868055555555556 | 0 |
| 0.9874999999999999 | 0 |
| 0.9881944444444444 | 0 |
| 0.9888888888888889 | 0 |
| 0.9895833333333334 | 0 |
| 0.9902777777777777 | 0 |
| 0.9909722222222223 | 0 |
| 0.9916666666666667 | 0 |
| 0.9923611111111111 | 0 |
| 0.9930555555555555 | 0 |
| 0.99375 | 0 |
| 0.9944444444444445 | 0 |
| 0.9951388888888889 | 0 |
| 0.9958333333333332 | 0 |
| 0.9965277777777778 | 0 |
| 0.9972222222222222 | 0 |
| 0.9979166666666667 | 0 |
| 0.998611111111111 | 0 |
| 0.9993055555555556 | 0 |